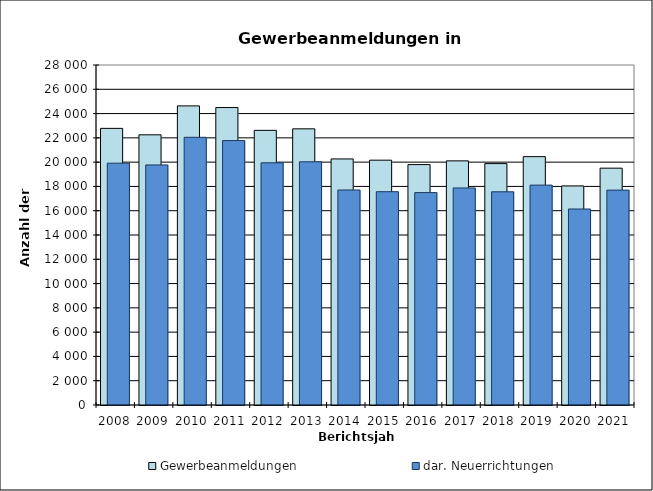
| Category | Gewerbeanmeldungen | dar. Neuerrichtungen |
|---|---|---|
| 2008.0 | 22781 | 19914 |
| 2009.0 | 22250 | 19769 |
| 2010.0 | 24632 | 22046 |
| 2011.0 | 24495 | 21777 |
| 2012.0 | 22618 | 19945 |
| 2013.0 | 22743 | 20029 |
| 2014.0 | 20264 | 17706 |
| 2015.0 | 20162 | 17566 |
| 2016.0 | 19798 | 17492 |
| 2017.0 | 20105 | 17874 |
| 2018.0 | 19880 | 17558 |
| 2019.0 | 20454 | 18108 |
| 2020.0 | 18040 | 16141 |
| 2021.0 | 19504 | 17696 |